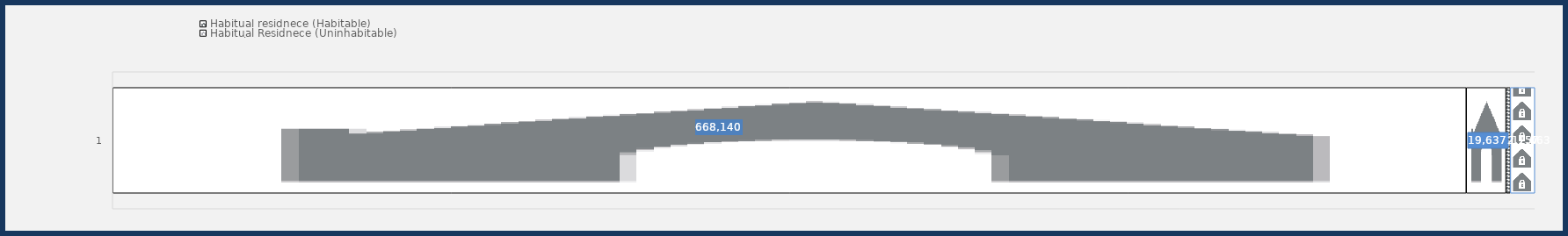
| Category | Habitual residnece (Habitable) | Habitual Residnece (Uninhabitable) | Critical | Private setting |
|---|---|---|---|---|
| 0 | 668140 | 19637 | 2157 | 12063 |